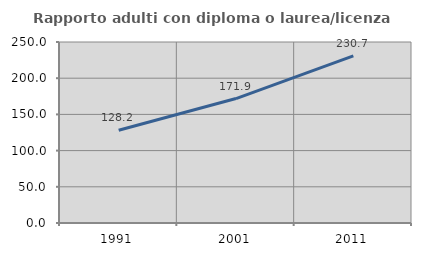
| Category | Rapporto adulti con diploma o laurea/licenza media  |
|---|---|
| 1991.0 | 128.162 |
| 2001.0 | 171.884 |
| 2011.0 | 230.736 |